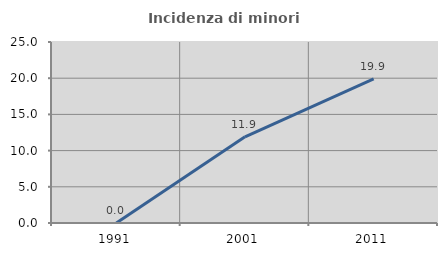
| Category | Incidenza di minori stranieri |
|---|---|
| 1991.0 | 0 |
| 2001.0 | 11.905 |
| 2011.0 | 19.903 |